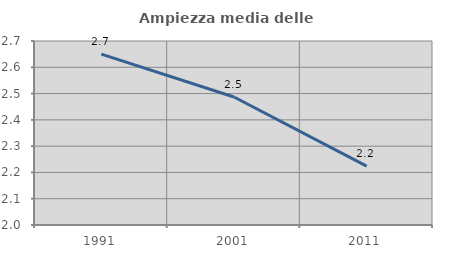
| Category | Ampiezza media delle famiglie |
|---|---|
| 1991.0 | 2.65 |
| 2001.0 | 2.487 |
| 2011.0 | 2.224 |